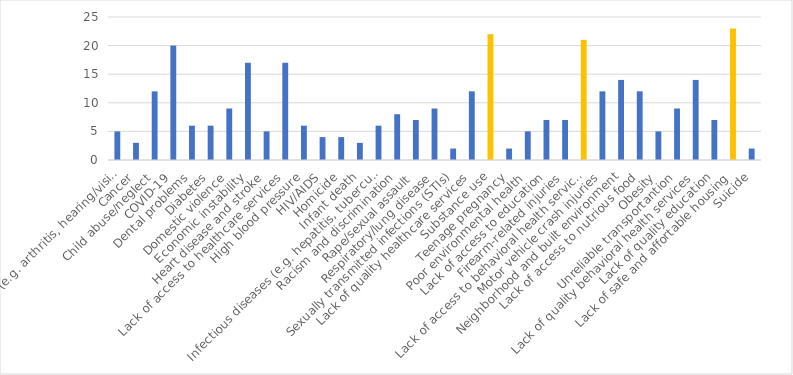
| Category | Number of Responses |
|---|---|
| Aging problems (e.g. arthritis, hearing/vision loss, etc.) | 5 |
| Cancer | 3 |
| Child abuse/neglect | 12 |
| COVID-19 | 20 |
| Dental problems | 6 |
| Diabetes | 6 |
| Domestic violence | 9 |
| Economic instability | 17 |
| Heart disease and stroke | 5 |
| Lack of access to healthcare services | 17 |
| High blood pressure | 6 |
| HIV/AIDS | 4 |
| Homicide | 4 |
| Infant death | 3 |
| Infectious diseases (e.g. hepatitis, tuberculosis, etc.) | 6 |
| Racism and discrimination | 8 |
| Rape/sexual assault | 7 |
| Respiratory/lung disease | 9 |
| Sexually transmitted infections (STIs) | 2 |
| Lack of quality healthcare services | 12 |
| Substance use | 22 |
| Teenage pregnancy | 2 |
| Poor environmental health | 5 |
| Lack of access to education | 7 |
| Firearm-related injuries | 7 |
| Lack of access to behavioral health services | 21 |
| Motor vehicle crash injuries | 12 |
| Neighborhood and built environment | 14 |
| Lack of access to nutrious food | 12 |
| Obesity | 5 |
| Unreliable transportantion | 9 |
| Lack of quality behavioral health services | 14 |
| Lack of quality education | 7 |
| Lack of safe and affortable housing | 23 |
| Suicide | 2 |